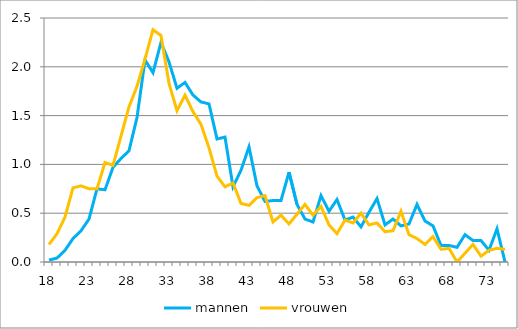
| Category | mannen | vrouwen |
|---|---|---|
| 18.0 | 0.02 | 0.18 |
| 19.0 | 0.04 | 0.29 |
| 20.0 | 0.12 | 0.46 |
| 21.0 | 0.24 | 0.76 |
| 22.0 | 0.32 | 0.78 |
| 23.0 | 0.44 | 0.75 |
| 24.0 | 0.75 | 0.75 |
| 25.0 | 0.74 | 1.02 |
| 26.0 | 0.97 | 0.99 |
| 27.0 | 1.06 | 1.29 |
| 28.0 | 1.14 | 1.59 |
| 29.0 | 1.48 | 1.8 |
| 30.0 | 2.07 | 2.08 |
| 31.0 | 1.94 | 2.38 |
| 32.0 | 2.25 | 2.32 |
| 33.0 | 2.05 | 1.83 |
| 34.0 | 1.78 | 1.55 |
| 35.0 | 1.84 | 1.71 |
| 36.0 | 1.71 | 1.54 |
| 37.0 | 1.64 | 1.41 |
| 38.0 | 1.62 | 1.17 |
| 39.0 | 1.26 | 0.88 |
| 40.0 | 1.28 | 0.77 |
| 41.0 | 0.77 | 0.81 |
| 42.0 | 0.94 | 0.6 |
| 43.0 | 1.18 | 0.58 |
| 44.0 | 0.78 | 0.66 |
| 45.0 | 0.62 | 0.68 |
| 46.0 | 0.63 | 0.41 |
| 47.0 | 0.63 | 0.48 |
| 48.0 | 0.92 | 0.39 |
| 49.0 | 0.59 | 0.49 |
| 50.0 | 0.44 | 0.59 |
| 51.0 | 0.41 | 0.48 |
| 52.0 | 0.68 | 0.57 |
| 53.0 | 0.52 | 0.38 |
| 54.0 | 0.64 | 0.29 |
| 55.0 | 0.43 | 0.43 |
| 56.0 | 0.46 | 0.4 |
| 57.0 | 0.36 | 0.5 |
| 58.0 | 0.51 | 0.38 |
| 59.0 | 0.65 | 0.4 |
| 60.0 | 0.38 | 0.31 |
| 61.0 | 0.44 | 0.32 |
| 62.0 | 0.37 | 0.52 |
| 63.0 | 0.39 | 0.28 |
| 64.0 | 0.59 | 0.24 |
| 65.0 | 0.42 | 0.18 |
| 66.0 | 0.37 | 0.26 |
| 67.0 | 0.17 | 0.13 |
| 68.0 | 0.17 | 0.14 |
| 69.0 | 0.15 | 0 |
| 70.0 | 0.28 | 0.09 |
| 71.0 | 0.22 | 0.18 |
| 72.0 | 0.22 | 0.06 |
| 73.0 | 0.12 | 0.12 |
| 74.0 | 0.34 | 0.14 |
| 75.0 | 0 | 0.13 |